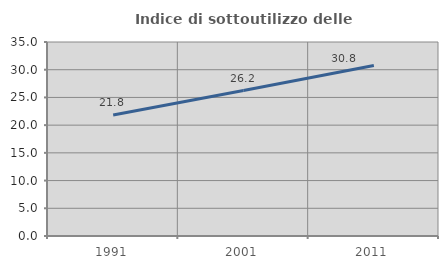
| Category | Indice di sottoutilizzo delle abitazioni  |
|---|---|
| 1991.0 | 21.821 |
| 2001.0 | 26.237 |
| 2011.0 | 30.752 |